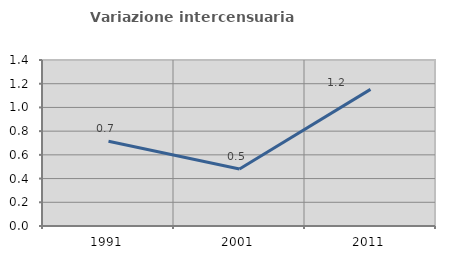
| Category | Variazione intercensuaria annua |
|---|---|
| 1991.0 | 0.714 |
| 2001.0 | 0.481 |
| 2011.0 | 1.152 |